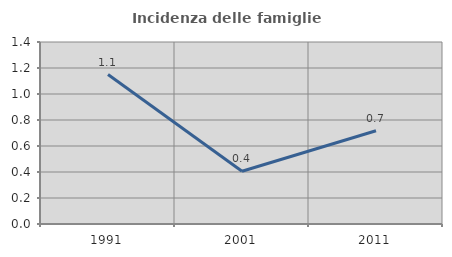
| Category | Incidenza delle famiglie numerose |
|---|---|
| 1991.0 | 1.149 |
| 2001.0 | 0.406 |
| 2011.0 | 0.718 |